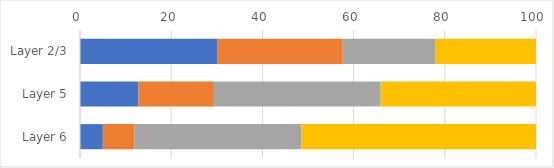
| Category | Series 0 | Series 1 | Series 2 | Series 3 |
|---|---|---|---|---|
| Layer 2/3 | 30.184 | 27.434 | 20.383 | 21.999 |
| Layer 5 | 12.825 | 16.343 | 36.764 | 34.068 |
| Layer 6 | 5.002 | 6.964 | 36.556 | 51.477 |